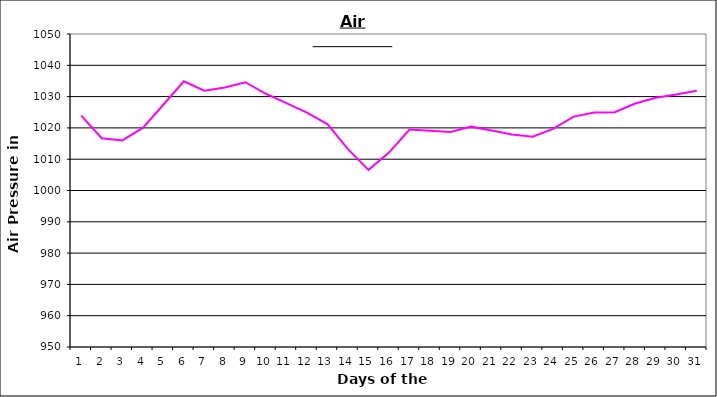
| Category | Series 0 |
|---|---|
| 0 | 1023.9 |
| 1 | 1016.7 |
| 2 | 1016 |
| 3 | 1020 |
| 4 | 1027.4 |
| 5 | 1034.9 |
| 6 | 1031.9 |
| 7 | 1032.9 |
| 8 | 1034.6 |
| 9 | 1030.9 |
| 10 | 1027.9 |
| 11 | 1024.9 |
| 12 | 1021.2 |
| 13 | 1013.2 |
| 14 | 1006.6 |
| 15 | 1012.1 |
| 16 | 1019.5 |
| 17 | 1019.1 |
| 18 | 1018.7 |
| 19 | 1020.4 |
| 20 | 1019.2 |
| 21 | 1017.9 |
| 22 | 1017.2 |
| 23 | 1019.7 |
| 24 | 1023.6 |
| 25 | 1024.9 |
| 26 | 1025 |
| 27 | 1027.8 |
| 28 | 1029.6 |
| 29 | 1030.7 |
| 30 | 1031.9 |